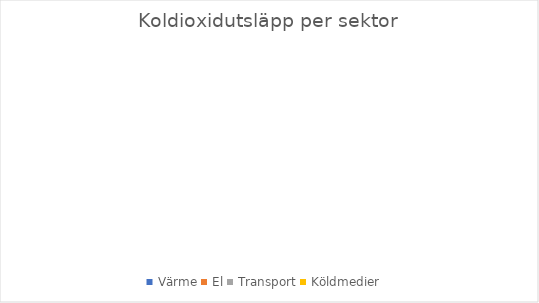
| Category | Koldioxidutsläpp per sektor |
|---|---|
| Värme | 0 |
| El | 0 |
| Transport | 0 |
| Köldmedier | 0 |